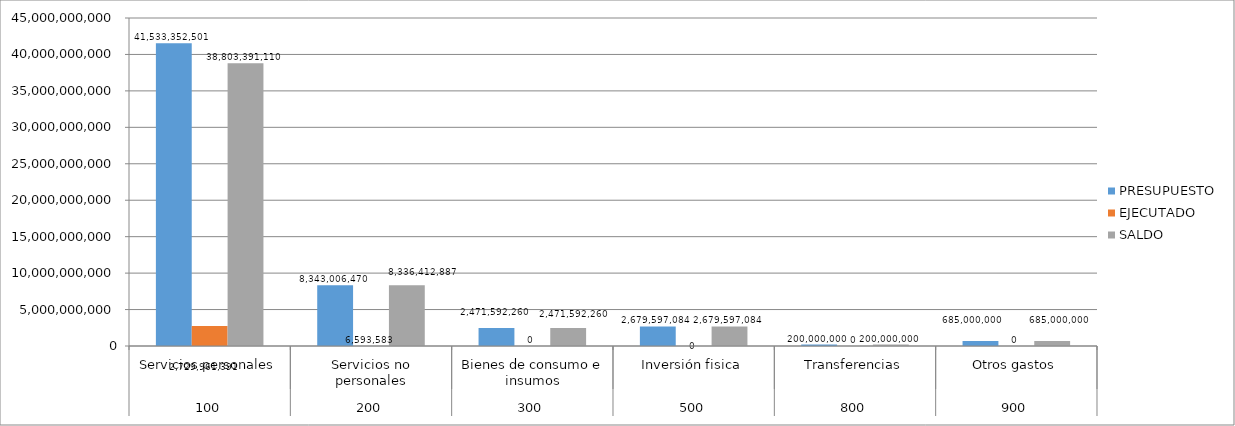
| Category | PRESUPUESTO | EJECUTADO | SALDO |
|---|---|---|---|
| 0 | 41533352501 | 2729961391 | 38803391110 |
| 1 | 8343006470 | 6593583 | 8336412887 |
| 2 | 2471592260 | 0 | 2471592260 |
| 3 | 2679597084 | 0 | 2679597084 |
| 4 | 200000000 | 0 | 200000000 |
| 5 | 685000000 | 0 | 685000000 |